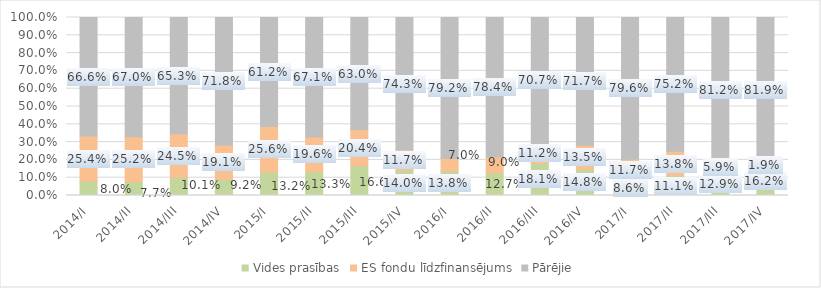
| Category | Vides prasības | ES fondu līdzfinansējums | Pārējie |
|---|---|---|---|
| 2014/I | 0.08 | 0.254 | 0.666 |
| 2014/II | 0.077 | 0.252 | 0.67 |
| 2014/III | 0.101 | 0.245 | 0.653 |
| 2014/IV | 0.092 | 0.191 | 0.718 |
| 2015/I | 0.132 | 0.256 | 0.612 |
| 2015/II | 0.133 | 0.196 | 0.671 |
| 2015/III | 0.166 | 0.204 | 0.63 |
| 2015/IV | 0.14 | 0.117 | 0.743 |
| 2016/I | 0.138 | 0.07 | 0.792 |
| 2016/II | 0.127 | 0.09 | 0.784 |
| 2016/III | 0.181 | 0.112 | 0.707 |
| 2016/IV | 0.148 | 0.135 | 0.717 |
| 2017/I | 0.086 | 0.117 | 0.796 |
| 2017/II | 0.111 | 0.138 | 0.752 |
| 2017/III | 0.129 | 0.059 | 0.812 |
| 2017/IV | 0.162 | 0.019 | 0.819 |